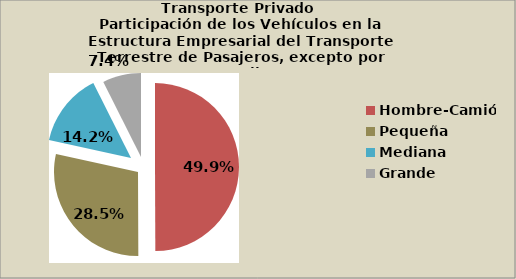
| Category | Series 0 |
|---|---|
| Hombre-Camión | 49.937 |
| Pequeña | 28.502 |
| Mediana | 14.156 |
| Grande | 7.404 |